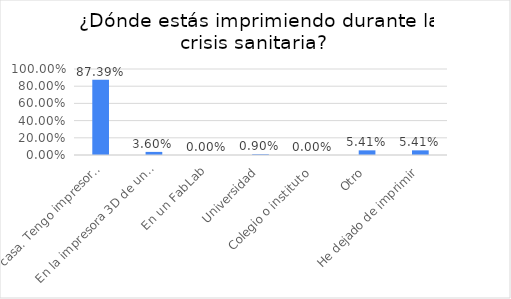
| Category | Series 0 |
|---|---|
| En casa. Tengo impresora 3D | 0.874 |
| En la impresora 3D de un amigo o conocido | 0.036 |
| En un FabLab | 0 |
| Universidad | 0.009 |
| Colegio o instituto | 0 |
| Otro | 0.054 |
| He dejado de imprimir | 0.054 |